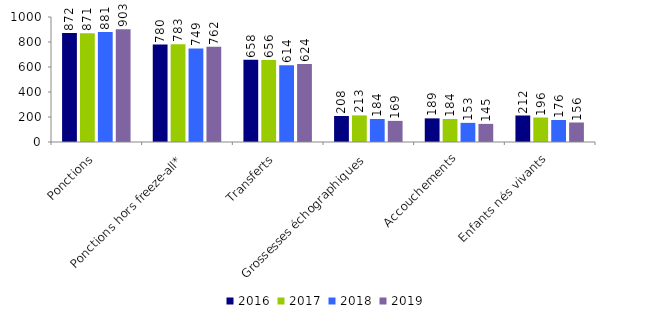
| Category | 2016 | 2017 | 2018 | 2019 |
|---|---|---|---|---|
| Ponctions | 872 | 871 | 881 | 903 |
| Ponctions hors freeze-all* | 780 | 783 | 749 | 762 |
| Transferts | 658 | 656 | 614 | 624 |
| Grossesses échographiques | 208 | 213 | 184 | 169 |
| Accouchements | 189 | 184 | 153 | 145 |
| Enfants nés vivants | 212 | 196 | 176 | 156 |